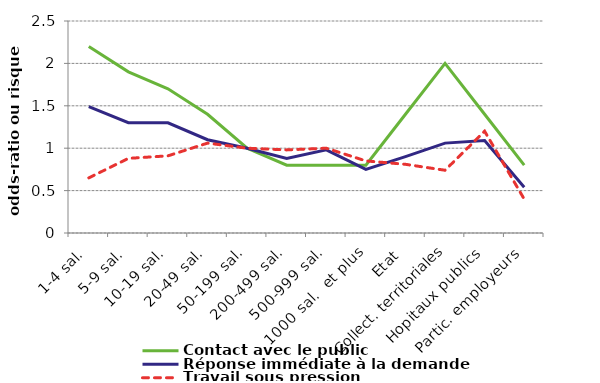
| Category | Contact avec le public | Réponse immédiate à la demande | Travail sous pression |
|---|---|---|---|
|  1-4 sal. | 2.2 | 1.49 | 0.65 |
|  5-9 sal. | 1.9 | 1.3 | 0.88 |
|  10-19 sal. | 1.7 | 1.3 | 0.91 |
| 20-49 sal. | 1.4 | 1.1 | 1.06 |
|  50-199 sal. | 1 | 1 | 1 |
|  200-499 sal. | 0.8 | 0.88 | 0.98 |
|  500-999 sal. | 0.8 | 0.98 | 1 |
|  1000 sal.  et plus | 0.8 | 0.75 | 0.85 |
| Etat | 1.4 | 0.9 | 0.81 |
| Collect. territoriales | 2 | 1.06 | 0.74 |
| Hopitaux publics | 1.4 | 1.09 | 1.2 |
| Partic. employeurs | 0.8 | 0.54 | 0.4 |